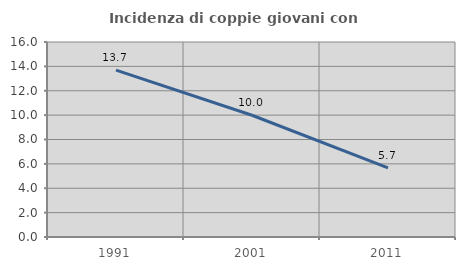
| Category | Incidenza di coppie giovani con figli |
|---|---|
| 1991.0 | 13.691 |
| 2001.0 | 9.991 |
| 2011.0 | 5.67 |